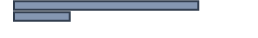
| Category | Percentatge |
|---|---|
| 0 | 76.783 |
| 1 | 23.217 |